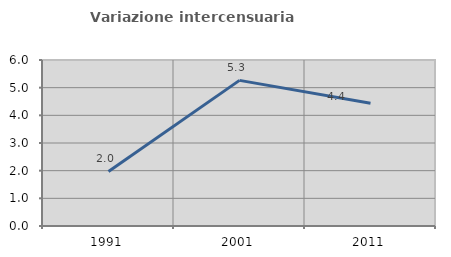
| Category | Variazione intercensuaria annua |
|---|---|
| 1991.0 | 1.971 |
| 2001.0 | 5.264 |
| 2011.0 | 4.438 |